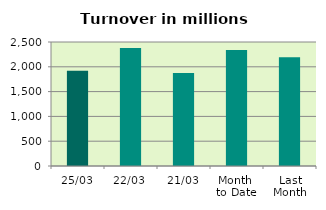
| Category | Series 0 |
|---|---|
| 25/03 | 1921.479 |
| 22/03 | 2380.861 |
| 21/03 | 1873.389 |
| Month 
to Date | 2336.499 |
| Last
Month | 2191.938 |